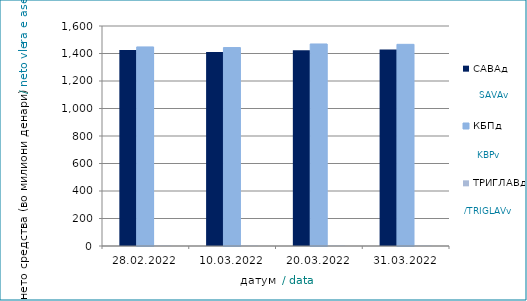
| Category | САВАд | КБПд | ТРИГЛАВд |
|---|---|---|---|
| 2022-02-28 | 1424.829 | 1447.906 | 3.581 |
| 2022-03-10 | 1411.131 | 1443.11 | 3.662 |
| 2022-03-20 | 1423.17 | 1469.246 | 3.746 |
| 2022-03-31 | 1429.055 | 1466.669 | 3.784 |